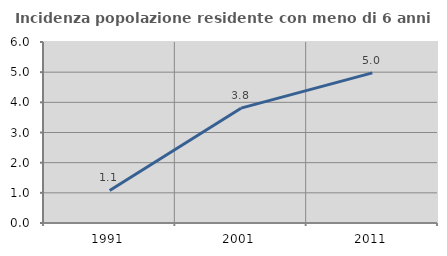
| Category | Incidenza popolazione residente con meno di 6 anni |
|---|---|
| 1991.0 | 1.078 |
| 2001.0 | 3.807 |
| 2011.0 | 4.976 |